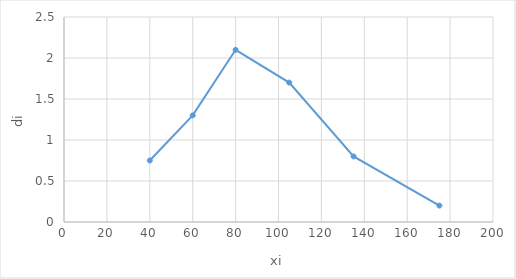
| Category | Series 0 |
|---|---|
| 40.0 | 0.75 |
| 60.0 | 1.3 |
| 80.0 | 2.1 |
| 105.0 | 1.7 |
| 135.0 | 0.8 |
| 175.0 | 0.2 |